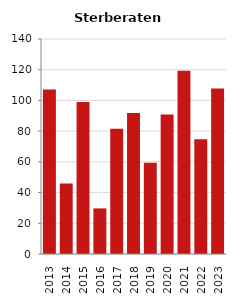
| Category | Sterberate der Bevölkerung ab 80 Jahre (auf Tsd.) |
|---|---|
| 2013.0 | 107.143 |
| 2014.0 | 45.977 |
| 2015.0 | 98.901 |
| 2016.0 | 29.703 |
| 2017.0 | 81.633 |
| 2018.0 | 91.837 |
| 2019.0 | 59.406 |
| 2020.0 | 90.909 |
| 2021.0 | 119.266 |
| 2022.0 | 74.766 |
| 2023.0 | 107.843 |